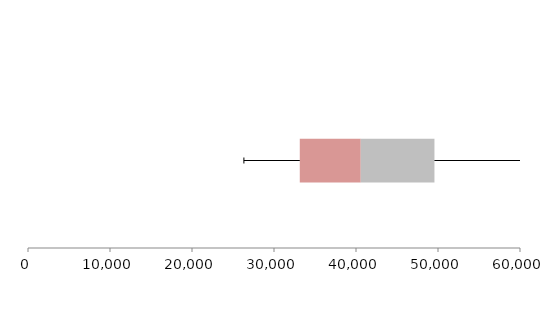
| Category | Series 1 | Series 2 | Series 3 |
|---|---|---|---|
| 0 | 33144.787 | 7435.061 | 8987.448 |